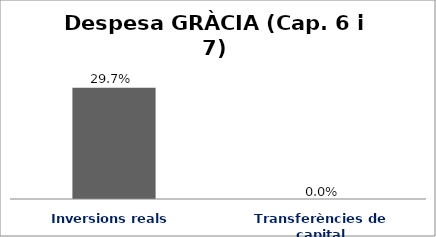
| Category | Series 0 |
|---|---|
| Inversions reals | 0.297 |
| Transferències de capital | 0 |